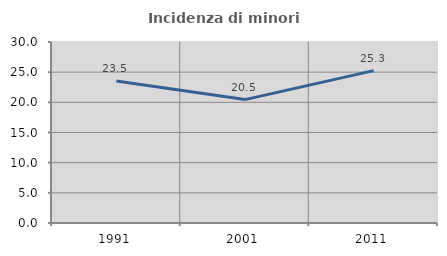
| Category | Incidenza di minori stranieri |
|---|---|
| 1991.0 | 23.529 |
| 2001.0 | 20.455 |
| 2011.0 | 25.253 |